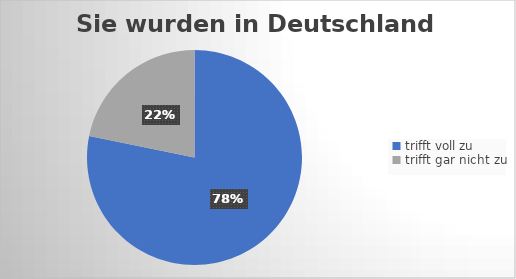
| Category | Sie wurden in Deutschland geboren. |
|---|---|
| trifft voll zu | 219 |
| trifft gar nicht zu | 61 |